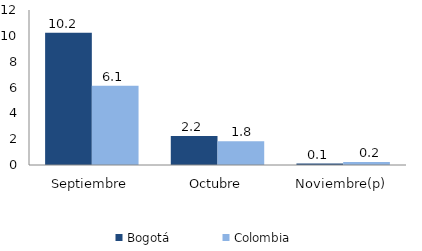
| Category | Bogotá | Colombia |
|---|---|---|
| Septiembre | 10.232 | 6.143 |
| Octubre | 2.25 | 1.834 |
| Noviembre(p) | 0.11 | 0.224 |